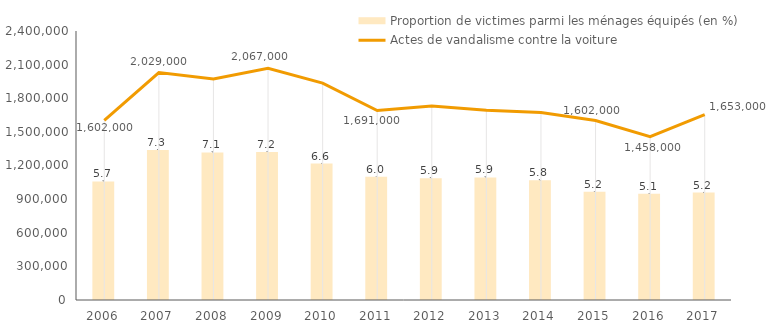
| Category | Proportion de victimes parmi les ménages équipés (en %) |
|---|---|
| 2006.0 | 5.731 |
| 2007.0 | 7.251 |
| 2008.0 | 7.134 |
| 2009.0 | 7.151 |
| 2010.0 | 6.596 |
| 2011.0 | 5.961 |
| 2012.0 | 5.888 |
| 2013.0 | 5.925 |
| 2014.0 | 5.781 |
| 2015.0 | 5.23 |
| 2016.0 | 5.13 |
| 2017.0 | 5.189 |